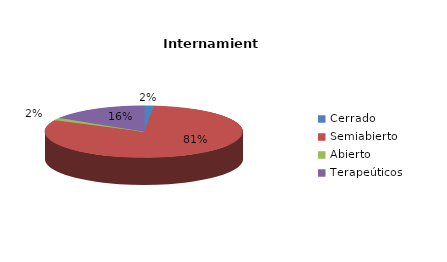
| Category | Series 0 |
|---|---|
| Cerrado | 1 |
| Semiabierto | 50 |
| Abierto | 1 |
| Terapeúticos | 10 |